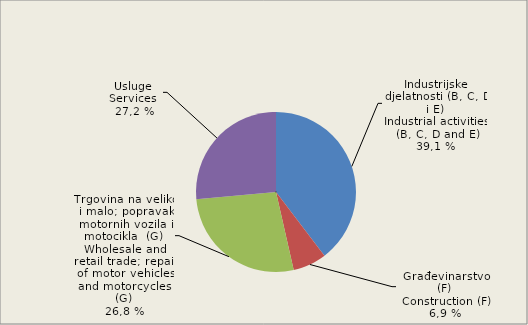
| Category | Broj zaposlenih osoba
Number of persons employed
  0 |
|---|---|
| Industrijske djelatnosti (B, C, D i E)
Industrial activities (B, C, D and E) | 39.6 |
| Građevinarstvo (F)
Construction (F) | 6.8 |
| Trgovina na veliko i malo; popravak motornih vozila i motocikla  (G) 
Wholesale and retail trade; repair of motor vehicles and motorcycles  (G)
 | 27.1 |
| Usluge 
Services  | 26.4 |